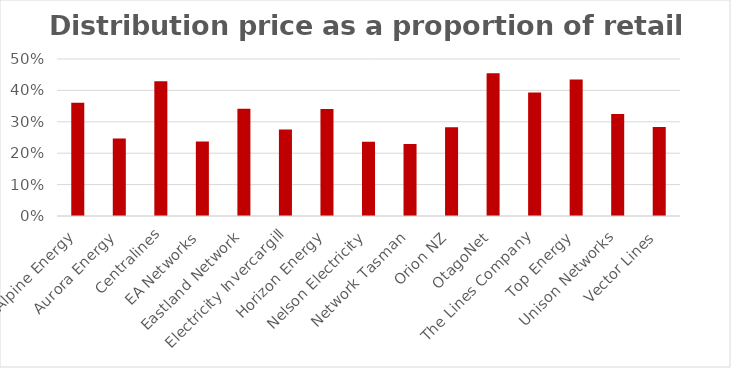
| Category | Distribution price as a proportion of retail price |
|---|---|
| Alpine Energy | 0.361 |
| Aurora Energy | 0.247 |
| Centralines | 0.43 |
| EA Networks | 0.237 |
| Eastland Network | 0.341 |
| Electricity Invercargill | 0.275 |
| Horizon Energy | 0.341 |
| Nelson Electricity | 0.237 |
| Network Tasman | 0.229 |
| Orion NZ | 0.282 |
| OtagoNet | 0.454 |
| The Lines Company | 0.393 |
| Top Energy | 0.435 |
| Unison Networks | 0.325 |
| Vector Lines | 0.284 |